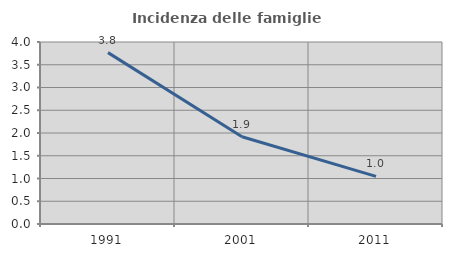
| Category | Incidenza delle famiglie numerose |
|---|---|
| 1991.0 | 3.767 |
| 2001.0 | 1.918 |
| 2011.0 | 1.046 |